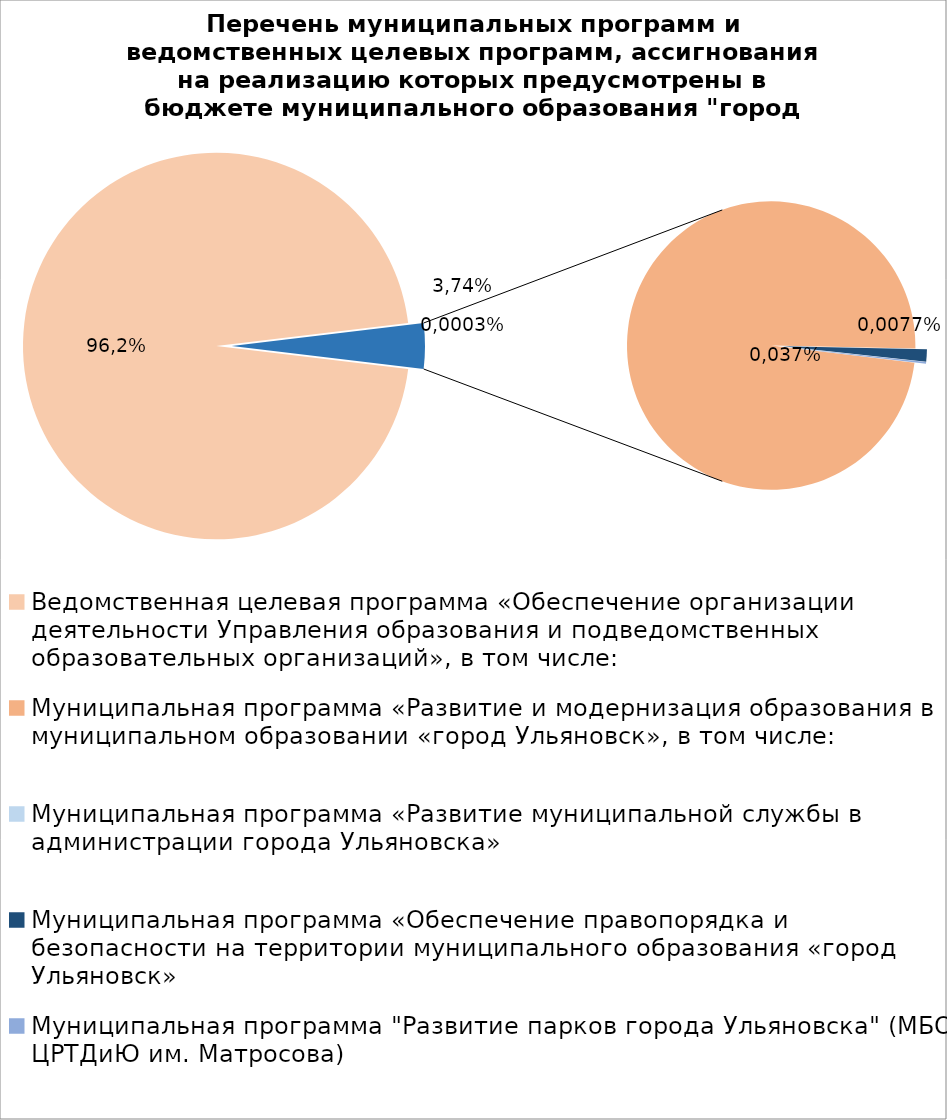
| Category | Series 0 |
|---|---|
| Ведомственная целевая программа «Обеспечение организации деятельности Управления образования и подведомственных образовательных организаций», в том числе: | 4978036.18 |
| Муниципальная программа «Развитие и модернизация образования в муниципальном образовании «город Ульяновск», в том числе: | 193238.58 |
| Муниципальная программа «Развитие муниципальной службы в администрации города Ульяновска» | 15.4 |
| Муниципальная программа «Обеспечение правопорядка и безопасности на территории муниципального образования «город Ульяновск» | 2700 |
| Муниципальная программа "Развитие парков города Ульяновска" (МБОУ ЦРТДиЮ им. Матросова) | 400 |